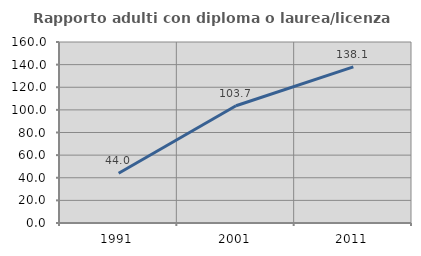
| Category | Rapporto adulti con diploma o laurea/licenza media  |
|---|---|
| 1991.0 | 44 |
| 2001.0 | 103.689 |
| 2011.0 | 138.075 |